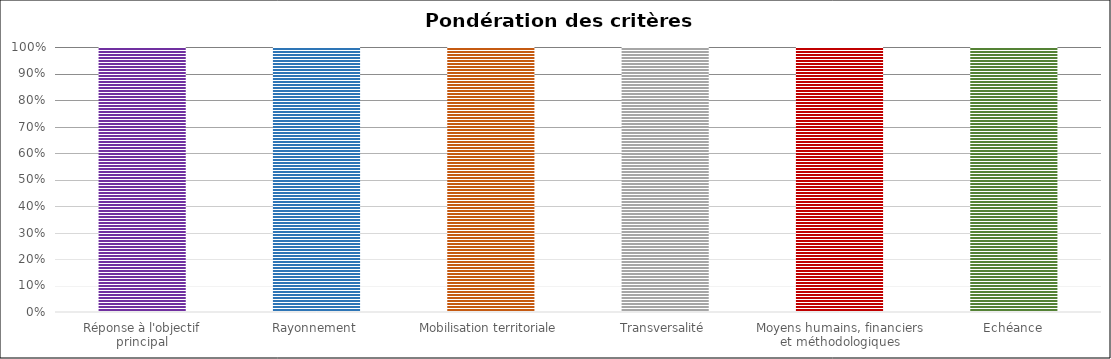
| Category | Series 0 |
|---|---|
| Réponse à l'objectif principal | 1 |
| Rayonnement | 1 |
| Mobilisation territoriale | 1 |
| Transversalité | 1 |
| Moyens humains, financiers et méthodologiques | 1 |
| Echéance | 1 |